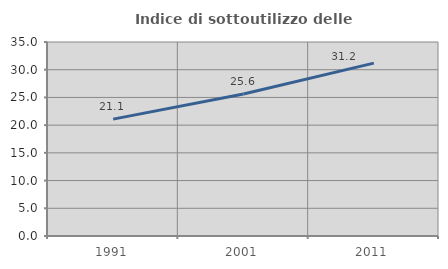
| Category | Indice di sottoutilizzo delle abitazioni  |
|---|---|
| 1991.0 | 21.09 |
| 2001.0 | 25.627 |
| 2011.0 | 31.183 |